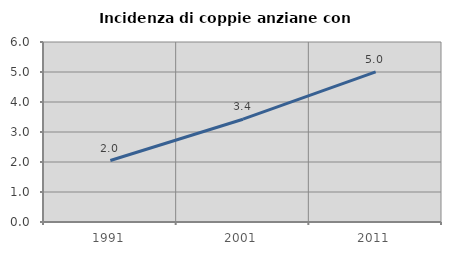
| Category | Incidenza di coppie anziane con figli |
|---|---|
| 1991.0 | 2.049 |
| 2001.0 | 3.426 |
| 2011.0 | 5.007 |